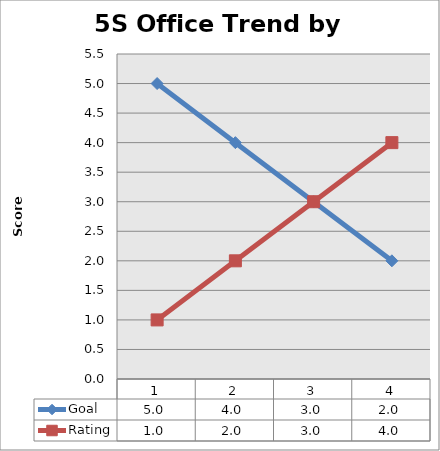
| Category | Goal | Rating  |
|---|---|---|
| 1.0 | 5 | 1 |
| 2.0 | 4 | 2 |
| 3.0 | 3 | 3 |
| 4.0 | 2 | 4 |